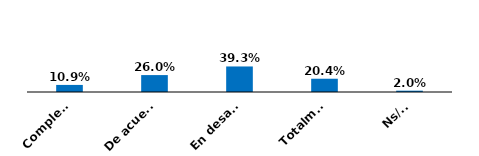
| Category | Series 0 |
|---|---|
| Completamente de acuerdo | 0.109 |
| De acuerdo | 0.26 |
| En desacuerdo | 0.393 |
| Totalmente en desacuerdo | 0.204 |
| Ns/Nr | 0.02 |